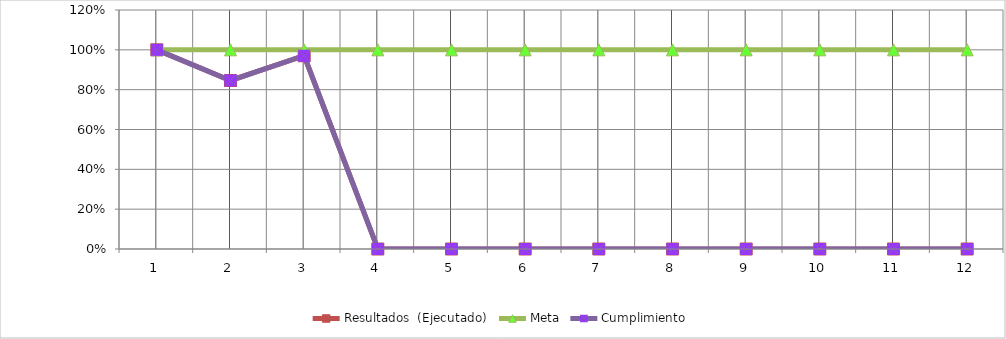
| Category | Resultados  (Ejecutado) | Meta | Cumplimiento |
|---|---|---|---|
| 0 | 1 | 1 | 1 |
| 1 | 0.846 | 1 | 0.846 |
| 2 | 0.97 | 1 | 0.97 |
| 3 | 0 | 1 | 0 |
| 4 | 0 | 1 | 0 |
| 5 | 0 | 1 | 0 |
| 6 | 0 | 1 | 0 |
| 7 | 0 | 1 | 0 |
| 8 | 0 | 1 | 0 |
| 9 | 0 | 1 | 0 |
| 10 | 0 | 1 | 0 |
| 11 | 0 | 1 | 0 |